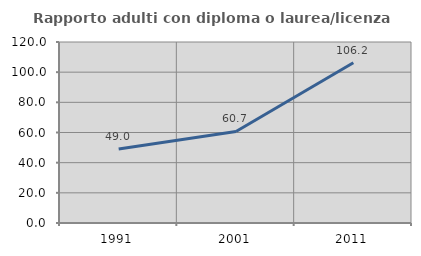
| Category | Rapporto adulti con diploma o laurea/licenza media  |
|---|---|
| 1991.0 | 49 |
| 2001.0 | 60.714 |
| 2011.0 | 106.231 |